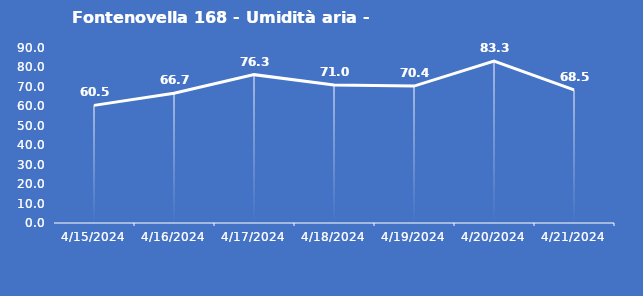
| Category | Fontenovella 168 - Umidità aria - Grezzo (%) |
|---|---|
| 4/15/24 | 60.5 |
| 4/16/24 | 66.7 |
| 4/17/24 | 76.3 |
| 4/18/24 | 71 |
| 4/19/24 | 70.4 |
| 4/20/24 | 83.3 |
| 4/21/24 | 68.5 |